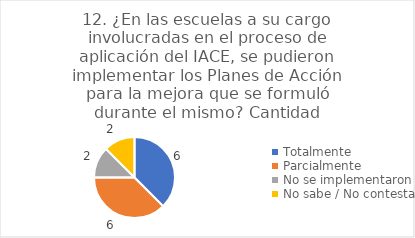
| Category | 12. ¿En las escuelas a su cargo involucradas en el proceso de aplicación del IACE, se pudieron implementar los Planes de Acción para la mejora que se formuló durante el mismo? |
|---|---|
| Totalmente  | 0.375 |
| Parcialmente  | 0.375 |
| No se implementaron  | 0.125 |
| No sabe / No contesta | 0.125 |